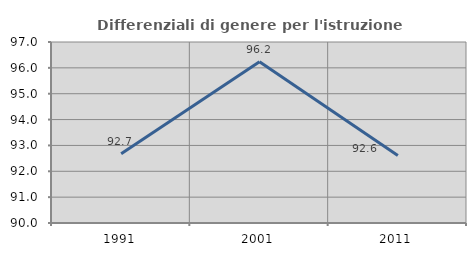
| Category | Differenziali di genere per l'istruzione superiore |
|---|---|
| 1991.0 | 92.678 |
| 2001.0 | 96.233 |
| 2011.0 | 92.612 |